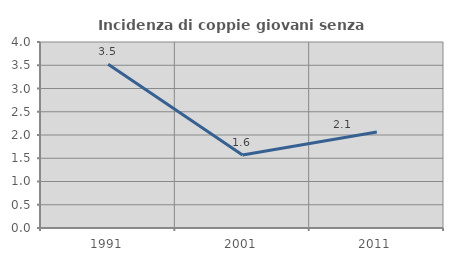
| Category | Incidenza di coppie giovani senza figli |
|---|---|
| 1991.0 | 3.521 |
| 2001.0 | 1.569 |
| 2011.0 | 2.066 |